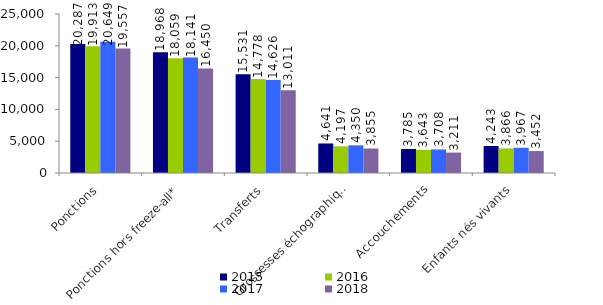
| Category | 2015 | 2016 | 2017 | 2018 |
|---|---|---|---|---|
| Ponctions | 20287 | 19913 | 20649 | 19557 |
| Ponctions hors freeze-all* | 18968 | 18059 | 18141 | 16450 |
| Transferts | 15531 | 14778 | 14626 | 13011 |
| Grossesses échographiques | 4641 | 4197 | 4350 | 3855 |
| Accouchements | 3785 | 3643 | 3708 | 3211 |
| Enfants nés vivants | 4243 | 3866 | 3967 | 3452 |